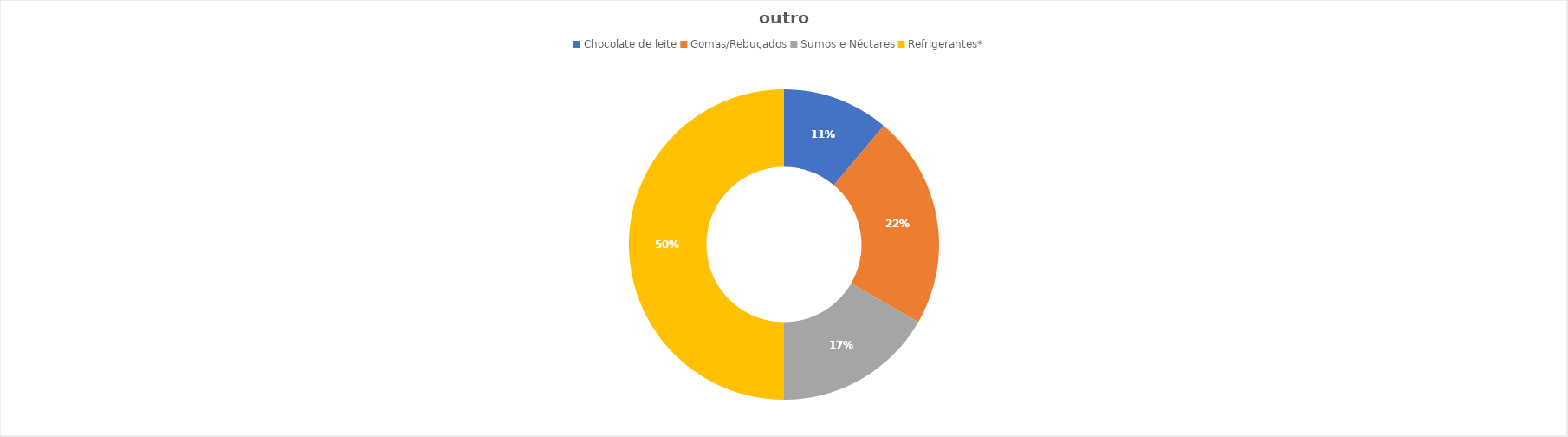
| Category | nº de respostas |
|---|---|
| Chocolate de leite | 2 |
| Gomas/Rebuçados | 4 |
| Sumos e Néctares | 3 |
| Refrigerantes* | 9 |